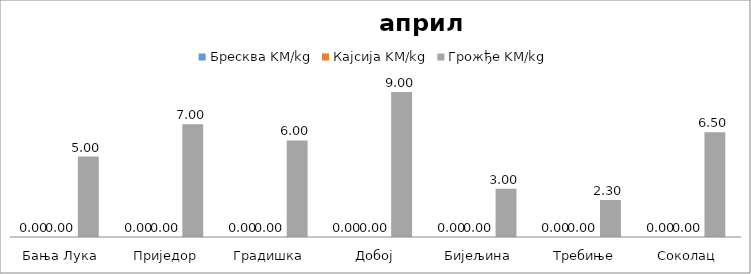
| Category | Бресква KM/kg | Кајсија KM/kg | Грожђе KM/kg |
|---|---|---|---|
| Бања Лука | 0 | 0 | 5 |
| Приједор | 0 | 0 | 7 |
| Градишка | 0 | 0 | 6 |
| Добој | 0 | 0 | 9 |
| Бијељина | 0 | 0 | 3 |
|  Требиње | 0 | 0 | 2.3 |
| Соколац | 0 | 0 | 6.5 |